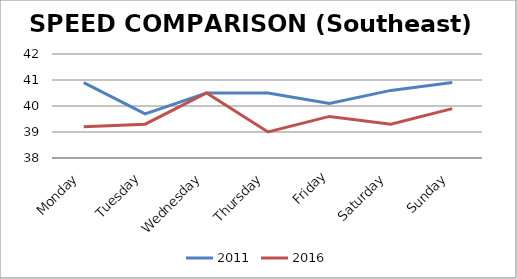
| Category | 2011 | 2016 |
|---|---|---|
| Monday | 40.9 | 39.2 |
| Tuesday | 39.7 | 39.3 |
| Wednesday | 40.5 | 40.5 |
| Thursday | 40.5 | 39 |
| Friday | 40.1 | 39.6 |
| Saturday | 40.6 | 39.3 |
| Sunday | 40.9 | 39.9 |